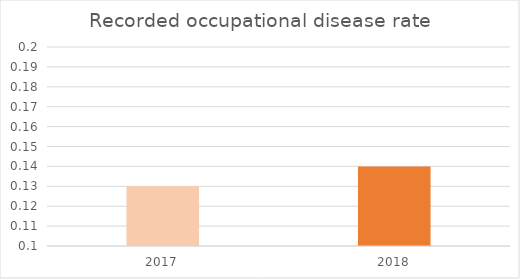
| Category | Series 0 |
|---|---|
| 0 | 0.13 |
| 1 | 0.14 |